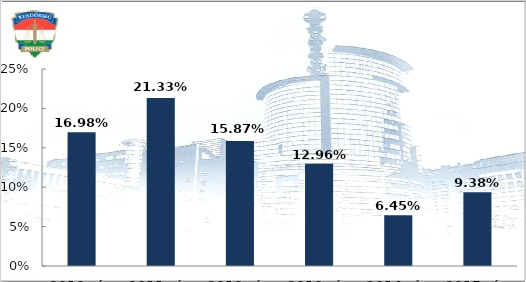
| Category | Ittasan okozott személysérüléses közúti közlekedési balesetek aránya (%) |
|---|---|
| 2010. év | 0.17 |
| 2011. év | 0.213 |
| 2012. év | 0.159 |
| 2013. év | 0.13 |
| 2014. év | 0.065 |
| 2015. év | 0.094 |